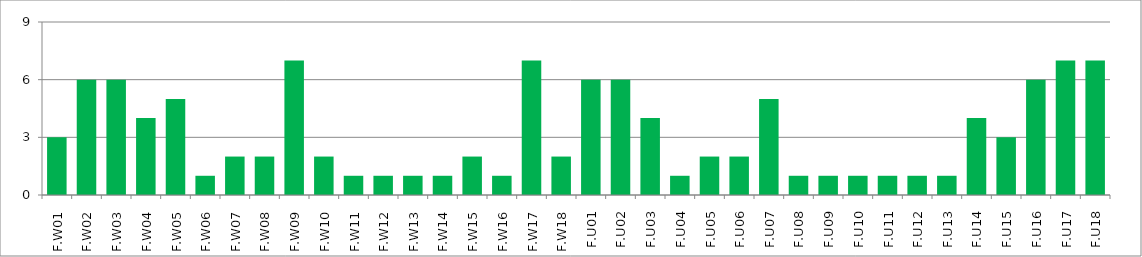
| Category | Series 0 |
|---|---|
| F.W01 | 3 |
| F.W02 | 6 |
| F.W03 | 6 |
| F.W04 | 4 |
| F.W05 | 5 |
| F.W06 | 1 |
| F.W07 | 2 |
| F.W08 | 2 |
| F.W09 | 7 |
| F.W10 | 2 |
| F.W11 | 1 |
| F.W12 | 1 |
| F.W13 | 1 |
| F.W14 | 1 |
| F.W15 | 2 |
| F.W16 | 1 |
| F.W17 | 7 |
| F.W18 | 2 |
| F.U01 | 6 |
| F.U02 | 6 |
| F.U03 | 4 |
| F.U04 | 1 |
| F.U05 | 2 |
| F.U06 | 2 |
| F.U07 | 5 |
| F.U08 | 1 |
| F.U09 | 1 |
| F.U10 | 1 |
| F.U11 | 1 |
| F.U12 | 1 |
| F.U13 | 1 |
| F.U14 | 4 |
| F.U15 | 3 |
| F.U16 | 6 |
| F.U17 | 7 |
| F.U18 | 7 |